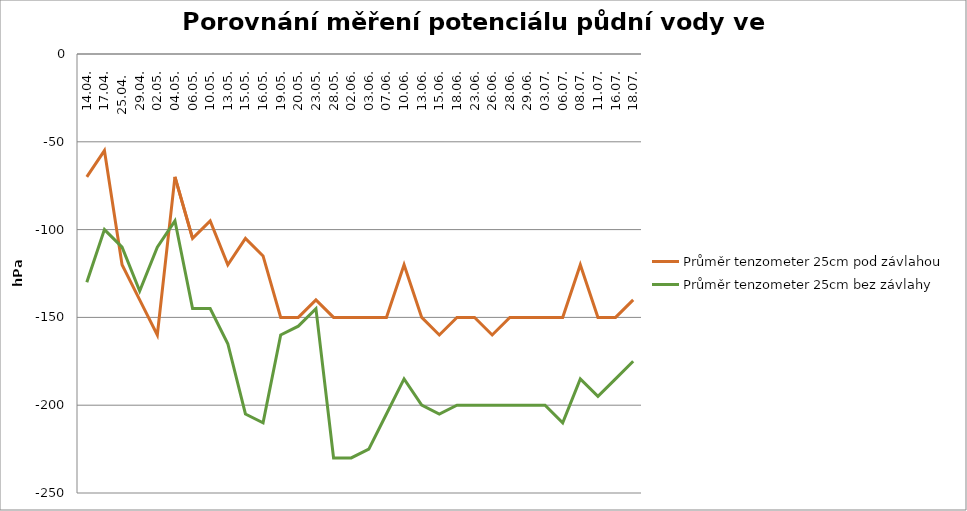
| Category | Tenzometer 2 - 25cm | Průměr tenzometer 25cm pod závlahou | Tenzometer 55cm pod závlahou | Tenzometer 1 - 25cm | Průměr tenzometer 25cm bez závlahy |
|---|---|---|---|---|---|
| 14.04. |  | -70 |  |  | -130 |
| 17.04. |  | -55 |  |  | -100 |
| 25.04.  |  | -120 |  |  | -110 |
| 29.04. |  | -140 |  |  | -135 |
| 02.05. |  | -160 |  |  | -110 |
| 04.05. |  | -70 |  |  | -95 |
| 06.05. |  | -105 |  |  | -145 |
| 10.05. |  | -95 |  |  | -145 |
| 13.05. |  | -120 |  |  | -165 |
| 15.05. |  | -105 |  |  | -205 |
| 16.05. |  | -115 |  |  | -210 |
| 19.05. |  | -150 |  |  | -160 |
| 20.05. |  | -150 |  |  | -155 |
| 23.05. |  | -140 |  |  | -145 |
| 28.05. |  | -150 |  |  | -230 |
| 02.06. |  | -150 |  |  | -230 |
| 03.06. |  | -150 |  |  | -225 |
| 07.06. |  | -150 |  |  | -205 |
| 10.06. |  | -120 |  |  | -185 |
| 13.06. |  | -150 |  |  | -200 |
| 15.06. |  | -160 |  |  | -205 |
| 18.06. |  | -150 |  |  | -200 |
| 23.06. |  | -150 |  |  | -200 |
| 26.06. |  | -160 |  |  | -200 |
| 28.06. |  | -150 |  |  | -200 |
| 29.06. |  | -150 |  |  | -200 |
| 03.07. |  | -150 |  |  | -200 |
| 06.07. |  | -150 |  |  | -210 |
| 08.07. |  | -120 |  |  | -185 |
| 11.07. |  | -150 |  |  | -195 |
| 16.07. |  | -150 |  |  | -185 |
| 18.07. |  | -140 |  |  | -175 |